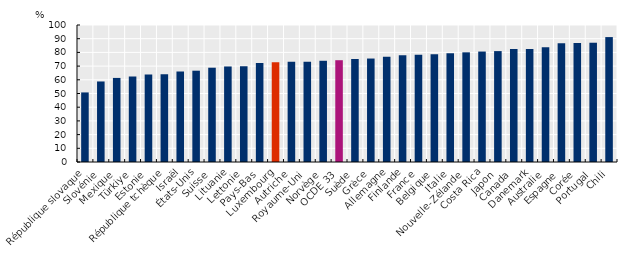
| Category | Series 0 |
|---|---|
| République slovaque | 50.78 |
| Slovénie | 58.78 |
| Mexique | 61.37 |
| Türkiye | 62.4 |
| Estonie | 63.88 |
| République tchèque | 64.1 |
| Israël | 66.09 |
| États-Unis | 66.65 |
| Suisse | 68.83 |
| Lituanie | 69.73 |
| Lettonie | 69.9 |
| Pays-Bas | 72.26 |
| Luxembourg | 72.78 |
| Autriche | 73.17 |
| Royaume-Uni | 73.2 |
| Norvège | 73.89 |
| OCDE 33 | 74.3 |
| Suède | 75.2 |
| Grèce | 75.52 |
| Allemagne | 76.88 |
| Finlande | 78 |
| France | 78.34 |
| Belgique | 78.62 |
| Italie | 79.4 |
| Nouvelle-Zélande | 80.05 |
| Costa Rica | 80.62 |
| Japon | 80.95 |
| Canada | 82.4 |
| Danemark | 82.5 |
| Australie | 83.8 |
| Espagne | 86.63 |
| Corée | 86.9 |
| Portugal | 87.06 |
| Chili | 91.18 |